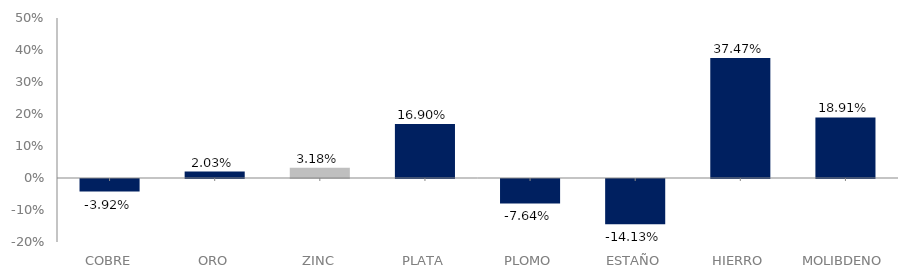
| Category | serie |
|---|---|
| 0 | -0.039 |
| 1 | 0.02 |
| 2 | 0.032 |
| 3 | 0.169 |
| 4 | -0.076 |
| 5 | -0.141 |
| 6 | 0.375 |
| 7 | 0.189 |